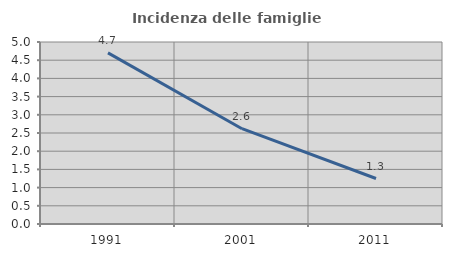
| Category | Incidenza delle famiglie numerose |
|---|---|
| 1991.0 | 4.703 |
| 2001.0 | 2.618 |
| 2011.0 | 1.25 |